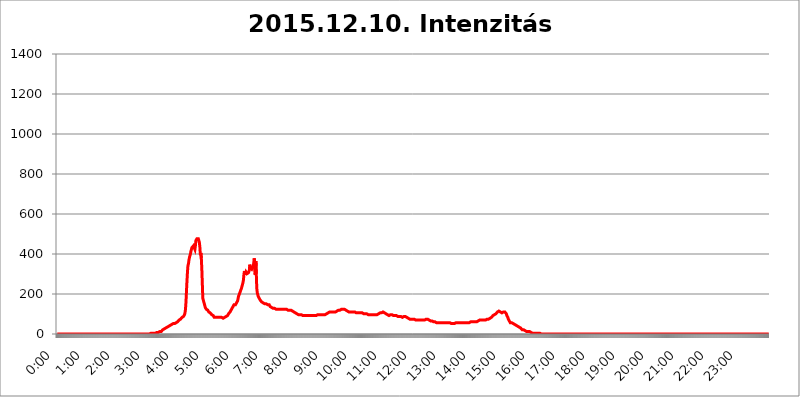
| Category | 2015.12.10. Intenzitás [W/m^2] |
|---|---|
| 0.0 | 0 |
| 0.0006944444444444445 | 0 |
| 0.001388888888888889 | 0 |
| 0.0020833333333333333 | 0 |
| 0.002777777777777778 | 0 |
| 0.003472222222222222 | 0 |
| 0.004166666666666667 | 0 |
| 0.004861111111111111 | 0 |
| 0.005555555555555556 | 0 |
| 0.0062499999999999995 | 0 |
| 0.006944444444444444 | 0 |
| 0.007638888888888889 | 0 |
| 0.008333333333333333 | 0 |
| 0.009027777777777779 | 0 |
| 0.009722222222222222 | 0 |
| 0.010416666666666666 | 0 |
| 0.011111111111111112 | 0 |
| 0.011805555555555555 | 0 |
| 0.012499999999999999 | 0 |
| 0.013194444444444444 | 0 |
| 0.013888888888888888 | 0 |
| 0.014583333333333332 | 0 |
| 0.015277777777777777 | 0 |
| 0.015972222222222224 | 0 |
| 0.016666666666666666 | 0 |
| 0.017361111111111112 | 0 |
| 0.018055555555555557 | 0 |
| 0.01875 | 0 |
| 0.019444444444444445 | 0 |
| 0.02013888888888889 | 0 |
| 0.020833333333333332 | 0 |
| 0.02152777777777778 | 0 |
| 0.022222222222222223 | 0 |
| 0.02291666666666667 | 0 |
| 0.02361111111111111 | 0 |
| 0.024305555555555556 | 0 |
| 0.024999999999999998 | 0 |
| 0.025694444444444447 | 0 |
| 0.02638888888888889 | 0 |
| 0.027083333333333334 | 0 |
| 0.027777777777777776 | 0 |
| 0.02847222222222222 | 0 |
| 0.029166666666666664 | 0 |
| 0.029861111111111113 | 0 |
| 0.030555555555555555 | 0 |
| 0.03125 | 0 |
| 0.03194444444444445 | 0 |
| 0.03263888888888889 | 0 |
| 0.03333333333333333 | 0 |
| 0.034027777777777775 | 0 |
| 0.034722222222222224 | 0 |
| 0.035416666666666666 | 0 |
| 0.036111111111111115 | 0 |
| 0.03680555555555556 | 0 |
| 0.0375 | 0 |
| 0.03819444444444444 | 0 |
| 0.03888888888888889 | 0 |
| 0.03958333333333333 | 0 |
| 0.04027777777777778 | 0 |
| 0.04097222222222222 | 0 |
| 0.041666666666666664 | 0 |
| 0.042361111111111106 | 0 |
| 0.04305555555555556 | 0 |
| 0.043750000000000004 | 0 |
| 0.044444444444444446 | 0 |
| 0.04513888888888889 | 0 |
| 0.04583333333333334 | 0 |
| 0.04652777777777778 | 0 |
| 0.04722222222222222 | 0 |
| 0.04791666666666666 | 0 |
| 0.04861111111111111 | 0 |
| 0.049305555555555554 | 0 |
| 0.049999999999999996 | 0 |
| 0.05069444444444445 | 0 |
| 0.051388888888888894 | 0 |
| 0.052083333333333336 | 0 |
| 0.05277777777777778 | 0 |
| 0.05347222222222222 | 0 |
| 0.05416666666666667 | 0 |
| 0.05486111111111111 | 0 |
| 0.05555555555555555 | 0 |
| 0.05625 | 0 |
| 0.05694444444444444 | 0 |
| 0.057638888888888885 | 0 |
| 0.05833333333333333 | 0 |
| 0.05902777777777778 | 0 |
| 0.059722222222222225 | 0 |
| 0.06041666666666667 | 0 |
| 0.061111111111111116 | 0 |
| 0.06180555555555556 | 0 |
| 0.0625 | 0 |
| 0.06319444444444444 | 0 |
| 0.06388888888888888 | 0 |
| 0.06458333333333334 | 0 |
| 0.06527777777777778 | 0 |
| 0.06597222222222222 | 0 |
| 0.06666666666666667 | 0 |
| 0.06736111111111111 | 0 |
| 0.06805555555555555 | 0 |
| 0.06874999999999999 | 0 |
| 0.06944444444444443 | 0 |
| 0.07013888888888889 | 0 |
| 0.07083333333333333 | 0 |
| 0.07152777777777779 | 0 |
| 0.07222222222222223 | 0 |
| 0.07291666666666667 | 0 |
| 0.07361111111111111 | 0 |
| 0.07430555555555556 | 0 |
| 0.075 | 0 |
| 0.07569444444444444 | 0 |
| 0.0763888888888889 | 0 |
| 0.07708333333333334 | 0 |
| 0.07777777777777778 | 0 |
| 0.07847222222222222 | 0 |
| 0.07916666666666666 | 0 |
| 0.0798611111111111 | 0 |
| 0.08055555555555556 | 0 |
| 0.08125 | 0 |
| 0.08194444444444444 | 0 |
| 0.08263888888888889 | 0 |
| 0.08333333333333333 | 0 |
| 0.08402777777777777 | 0 |
| 0.08472222222222221 | 0 |
| 0.08541666666666665 | 0 |
| 0.08611111111111112 | 0 |
| 0.08680555555555557 | 0 |
| 0.08750000000000001 | 0 |
| 0.08819444444444445 | 0 |
| 0.08888888888888889 | 0 |
| 0.08958333333333333 | 0 |
| 0.09027777777777778 | 0 |
| 0.09097222222222222 | 0 |
| 0.09166666666666667 | 0 |
| 0.09236111111111112 | 0 |
| 0.09305555555555556 | 0 |
| 0.09375 | 0 |
| 0.09444444444444444 | 0 |
| 0.09513888888888888 | 0 |
| 0.09583333333333333 | 0 |
| 0.09652777777777777 | 0 |
| 0.09722222222222222 | 0 |
| 0.09791666666666667 | 0 |
| 0.09861111111111111 | 0 |
| 0.09930555555555555 | 0 |
| 0.09999999999999999 | 0 |
| 0.10069444444444443 | 0 |
| 0.1013888888888889 | 0 |
| 0.10208333333333335 | 0 |
| 0.10277777777777779 | 0 |
| 0.10347222222222223 | 0 |
| 0.10416666666666667 | 0 |
| 0.10486111111111111 | 0 |
| 0.10555555555555556 | 0 |
| 0.10625 | 0 |
| 0.10694444444444444 | 0 |
| 0.1076388888888889 | 0 |
| 0.10833333333333334 | 0 |
| 0.10902777777777778 | 0 |
| 0.10972222222222222 | 0 |
| 0.1111111111111111 | 0 |
| 0.11180555555555556 | 0 |
| 0.11180555555555556 | 0 |
| 0.1125 | 0 |
| 0.11319444444444444 | 0 |
| 0.11388888888888889 | 0 |
| 0.11458333333333333 | 0 |
| 0.11527777777777777 | 0 |
| 0.11597222222222221 | 0 |
| 0.11666666666666665 | 0 |
| 0.1173611111111111 | 0 |
| 0.11805555555555557 | 0 |
| 0.11944444444444445 | 0 |
| 0.12013888888888889 | 0 |
| 0.12083333333333333 | 0 |
| 0.12152777777777778 | 0 |
| 0.12222222222222223 | 0 |
| 0.12291666666666667 | 0 |
| 0.12291666666666667 | 0 |
| 0.12361111111111112 | 0 |
| 0.12430555555555556 | 0 |
| 0.125 | 0 |
| 0.12569444444444444 | 0 |
| 0.12638888888888888 | 0 |
| 0.12708333333333333 | 0 |
| 0.16875 | 0 |
| 0.12847222222222224 | 3.525 |
| 0.12916666666666668 | 0 |
| 0.12986111111111112 | 3.525 |
| 0.13055555555555556 | 3.525 |
| 0.13125 | 3.525 |
| 0.13194444444444445 | 3.525 |
| 0.1326388888888889 | 3.525 |
| 0.13333333333333333 | 3.525 |
| 0.13402777777777777 | 3.525 |
| 0.13402777777777777 | 3.525 |
| 0.13472222222222222 | 3.525 |
| 0.13541666666666666 | 3.525 |
| 0.1361111111111111 | 3.525 |
| 0.13749999999999998 | 3.525 |
| 0.13819444444444443 | 3.525 |
| 0.1388888888888889 | 7.887 |
| 0.13958333333333334 | 7.887 |
| 0.14027777777777778 | 7.887 |
| 0.14097222222222222 | 7.887 |
| 0.14166666666666666 | 7.887 |
| 0.1423611111111111 | 12.257 |
| 0.14305555555555557 | 12.257 |
| 0.14375000000000002 | 12.257 |
| 0.14444444444444446 | 12.257 |
| 0.1451388888888889 | 12.257 |
| 0.1451388888888889 | 12.257 |
| 0.14652777777777778 | 16.636 |
| 0.14722222222222223 | 16.636 |
| 0.14791666666666667 | 21.024 |
| 0.1486111111111111 | 21.024 |
| 0.14930555555555555 | 21.024 |
| 0.15 | 25.419 |
| 0.15069444444444444 | 25.419 |
| 0.15138888888888888 | 25.419 |
| 0.15208333333333332 | 29.823 |
| 0.15277777777777776 | 29.823 |
| 0.15347222222222223 | 29.823 |
| 0.15416666666666667 | 34.234 |
| 0.15486111111111112 | 34.234 |
| 0.15555555555555556 | 38.653 |
| 0.15625 | 38.653 |
| 0.15694444444444444 | 38.653 |
| 0.15763888888888888 | 43.079 |
| 0.15833333333333333 | 43.079 |
| 0.15902777777777777 | 43.079 |
| 0.15972222222222224 | 47.511 |
| 0.16041666666666668 | 47.511 |
| 0.16111111111111112 | 51.951 |
| 0.16180555555555556 | 51.951 |
| 0.1625 | 51.951 |
| 0.16319444444444445 | 51.951 |
| 0.1638888888888889 | 51.951 |
| 0.16458333333333333 | 51.951 |
| 0.16527777777777777 | 56.398 |
| 0.16597222222222222 | 56.398 |
| 0.16666666666666666 | 56.398 |
| 0.1673611111111111 | 56.398 |
| 0.16805555555555554 | 56.398 |
| 0.16874999999999998 | 60.85 |
| 0.16944444444444443 | 60.85 |
| 0.17013888888888887 | 65.31 |
| 0.1708333333333333 | 69.775 |
| 0.17152777777777775 | 69.775 |
| 0.17222222222222225 | 74.246 |
| 0.1729166666666667 | 74.246 |
| 0.17361111111111113 | 78.722 |
| 0.17430555555555557 | 78.722 |
| 0.17500000000000002 | 83.205 |
| 0.17569444444444446 | 83.205 |
| 0.1763888888888889 | 83.205 |
| 0.17708333333333334 | 87.692 |
| 0.17777777777777778 | 92.184 |
| 0.17847222222222223 | 96.682 |
| 0.17916666666666667 | 105.69 |
| 0.1798611111111111 | 123.758 |
| 0.18055555555555555 | 160.056 |
| 0.18125 | 214.746 |
| 0.18194444444444444 | 264.932 |
| 0.1826388888888889 | 310.44 |
| 0.18333333333333335 | 342.162 |
| 0.1840277777777778 | 351.198 |
| 0.18472222222222223 | 369.23 |
| 0.18541666666666667 | 382.715 |
| 0.18611111111111112 | 387.202 |
| 0.18680555555555556 | 400.638 |
| 0.1875 | 414.035 |
| 0.18819444444444444 | 422.943 |
| 0.18888888888888888 | 431.833 |
| 0.18958333333333333 | 436.27 |
| 0.19027777777777777 | 436.27 |
| 0.1909722222222222 | 440.702 |
| 0.19166666666666665 | 445.129 |
| 0.19236111111111112 | 445.129 |
| 0.19305555555555554 | 422.943 |
| 0.19375 | 440.702 |
| 0.19444444444444445 | 467.187 |
| 0.1951388888888889 | 467.187 |
| 0.19583333333333333 | 475.972 |
| 0.19652777777777777 | 475.972 |
| 0.19722222222222222 | 475.972 |
| 0.19791666666666666 | 475.972 |
| 0.1986111111111111 | 467.187 |
| 0.19930555555555554 | 458.38 |
| 0.19999999999999998 | 436.27 |
| 0.20069444444444443 | 396.164 |
| 0.20138888888888887 | 405.108 |
| 0.2020833333333333 | 378.224 |
| 0.2027777777777778 | 324.052 |
| 0.2034722222222222 | 251.251 |
| 0.2041666666666667 | 178.264 |
| 0.20486111111111113 | 173.709 |
| 0.20555555555555557 | 160.056 |
| 0.20625000000000002 | 150.964 |
| 0.20694444444444446 | 141.884 |
| 0.2076388888888889 | 132.814 |
| 0.20833333333333334 | 128.284 |
| 0.20902777777777778 | 123.758 |
| 0.20972222222222223 | 123.758 |
| 0.21041666666666667 | 119.235 |
| 0.2111111111111111 | 119.235 |
| 0.21180555555555555 | 114.716 |
| 0.2125 | 110.201 |
| 0.21319444444444444 | 110.201 |
| 0.2138888888888889 | 105.69 |
| 0.21458333333333335 | 105.69 |
| 0.2152777777777778 | 101.184 |
| 0.21597222222222223 | 101.184 |
| 0.21666666666666667 | 96.682 |
| 0.21736111111111112 | 96.682 |
| 0.21805555555555556 | 96.682 |
| 0.21875 | 92.184 |
| 0.21944444444444444 | 87.692 |
| 0.22013888888888888 | 83.205 |
| 0.22083333333333333 | 83.205 |
| 0.22152777777777777 | 83.205 |
| 0.2222222222222222 | 83.205 |
| 0.22291666666666665 | 78.722 |
| 0.2236111111111111 | 83.205 |
| 0.22430555555555556 | 83.205 |
| 0.225 | 83.205 |
| 0.22569444444444445 | 83.205 |
| 0.2263888888888889 | 83.205 |
| 0.22708333333333333 | 83.205 |
| 0.22777777777777777 | 83.205 |
| 0.22847222222222222 | 83.205 |
| 0.22916666666666666 | 83.205 |
| 0.2298611111111111 | 83.205 |
| 0.23055555555555554 | 83.205 |
| 0.23124999999999998 | 78.722 |
| 0.23194444444444443 | 78.722 |
| 0.23263888888888887 | 78.722 |
| 0.2333333333333333 | 78.722 |
| 0.2340277777777778 | 83.205 |
| 0.2347222222222222 | 83.205 |
| 0.2354166666666667 | 83.205 |
| 0.23611111111111113 | 83.205 |
| 0.23680555555555557 | 87.692 |
| 0.23750000000000002 | 92.184 |
| 0.23819444444444446 | 92.184 |
| 0.2388888888888889 | 92.184 |
| 0.23958333333333334 | 96.682 |
| 0.24027777777777778 | 101.184 |
| 0.24097222222222223 | 101.184 |
| 0.24166666666666667 | 105.69 |
| 0.2423611111111111 | 110.201 |
| 0.24305555555555555 | 114.716 |
| 0.24375 | 119.235 |
| 0.24444444444444446 | 123.758 |
| 0.24513888888888888 | 128.284 |
| 0.24583333333333335 | 132.814 |
| 0.2465277777777778 | 137.347 |
| 0.24722222222222223 | 141.884 |
| 0.24791666666666667 | 146.423 |
| 0.24861111111111112 | 146.423 |
| 0.24930555555555556 | 146.423 |
| 0.25 | 146.423 |
| 0.25069444444444444 | 150.964 |
| 0.2513888888888889 | 155.509 |
| 0.2520833333333333 | 160.056 |
| 0.25277777777777777 | 164.605 |
| 0.2534722222222222 | 173.709 |
| 0.25416666666666665 | 187.378 |
| 0.2548611111111111 | 191.937 |
| 0.2555555555555556 | 201.058 |
| 0.25625000000000003 | 205.62 |
| 0.2569444444444445 | 214.746 |
| 0.2576388888888889 | 219.309 |
| 0.25833333333333336 | 228.436 |
| 0.2590277777777778 | 237.564 |
| 0.25972222222222224 | 246.689 |
| 0.2604166666666667 | 255.813 |
| 0.2611111111111111 | 269.49 |
| 0.26180555555555557 | 296.808 |
| 0.2625 | 314.98 |
| 0.26319444444444445 | 296.808 |
| 0.2638888888888889 | 296.808 |
| 0.26458333333333334 | 310.44 |
| 0.2652777777777778 | 305.898 |
| 0.2659722222222222 | 301.354 |
| 0.26666666666666666 | 296.808 |
| 0.2673611111111111 | 301.354 |
| 0.26805555555555555 | 305.898 |
| 0.26875 | 305.898 |
| 0.26944444444444443 | 319.517 |
| 0.2701388888888889 | 346.682 |
| 0.2708333333333333 | 333.113 |
| 0.27152777777777776 | 337.639 |
| 0.2722222222222222 | 333.113 |
| 0.27291666666666664 | 324.052 |
| 0.2736111111111111 | 328.584 |
| 0.2743055555555555 | 328.584 |
| 0.27499999999999997 | 337.639 |
| 0.27569444444444446 | 360.221 |
| 0.27638888888888885 | 378.224 |
| 0.27708333333333335 | 373.729 |
| 0.2777777777777778 | 296.808 |
| 0.27847222222222223 | 364.728 |
| 0.2791666666666667 | 301.354 |
| 0.2798611111111111 | 228.436 |
| 0.28055555555555556 | 205.62 |
| 0.28125 | 196.497 |
| 0.28194444444444444 | 187.378 |
| 0.2826388888888889 | 182.82 |
| 0.2833333333333333 | 178.264 |
| 0.28402777777777777 | 173.709 |
| 0.2847222222222222 | 169.156 |
| 0.28541666666666665 | 164.605 |
| 0.28611111111111115 | 164.605 |
| 0.28680555555555554 | 160.056 |
| 0.28750000000000003 | 160.056 |
| 0.2881944444444445 | 155.509 |
| 0.2888888888888889 | 155.509 |
| 0.28958333333333336 | 155.509 |
| 0.2902777777777778 | 155.509 |
| 0.29097222222222224 | 150.964 |
| 0.2916666666666667 | 150.964 |
| 0.2923611111111111 | 150.964 |
| 0.29305555555555557 | 150.964 |
| 0.29375 | 150.964 |
| 0.29444444444444445 | 150.964 |
| 0.2951388888888889 | 146.423 |
| 0.29583333333333334 | 146.423 |
| 0.2965277777777778 | 146.423 |
| 0.2972222222222222 | 146.423 |
| 0.29791666666666666 | 141.884 |
| 0.2986111111111111 | 137.347 |
| 0.29930555555555555 | 137.347 |
| 0.3 | 137.347 |
| 0.30069444444444443 | 132.814 |
| 0.3013888888888889 | 132.814 |
| 0.3020833333333333 | 132.814 |
| 0.30277777777777776 | 128.284 |
| 0.3034722222222222 | 128.284 |
| 0.30416666666666664 | 128.284 |
| 0.3048611111111111 | 128.284 |
| 0.3055555555555555 | 128.284 |
| 0.30624999999999997 | 123.758 |
| 0.3069444444444444 | 123.758 |
| 0.3076388888888889 | 123.758 |
| 0.30833333333333335 | 123.758 |
| 0.3090277777777778 | 123.758 |
| 0.30972222222222223 | 123.758 |
| 0.3104166666666667 | 123.758 |
| 0.3111111111111111 | 123.758 |
| 0.31180555555555556 | 123.758 |
| 0.3125 | 123.758 |
| 0.31319444444444444 | 123.758 |
| 0.3138888888888889 | 123.758 |
| 0.3145833333333333 | 123.758 |
| 0.31527777777777777 | 123.758 |
| 0.3159722222222222 | 123.758 |
| 0.31666666666666665 | 123.758 |
| 0.31736111111111115 | 123.758 |
| 0.31805555555555554 | 123.758 |
| 0.31875000000000003 | 128.284 |
| 0.3194444444444445 | 123.758 |
| 0.3201388888888889 | 123.758 |
| 0.32083333333333336 | 123.758 |
| 0.3215277777777778 | 123.758 |
| 0.32222222222222224 | 119.235 |
| 0.3229166666666667 | 119.235 |
| 0.3236111111111111 | 119.235 |
| 0.32430555555555557 | 119.235 |
| 0.325 | 119.235 |
| 0.32569444444444445 | 119.235 |
| 0.3263888888888889 | 119.235 |
| 0.32708333333333334 | 119.235 |
| 0.3277777777777778 | 119.235 |
| 0.3284722222222222 | 114.716 |
| 0.32916666666666666 | 114.716 |
| 0.3298611111111111 | 114.716 |
| 0.33055555555555555 | 110.201 |
| 0.33125 | 110.201 |
| 0.33194444444444443 | 110.201 |
| 0.3326388888888889 | 110.201 |
| 0.3333333333333333 | 105.69 |
| 0.3340277777777778 | 105.69 |
| 0.3347222222222222 | 101.184 |
| 0.3354166666666667 | 105.69 |
| 0.3361111111111111 | 101.184 |
| 0.3368055555555556 | 101.184 |
| 0.33749999999999997 | 101.184 |
| 0.33819444444444446 | 96.682 |
| 0.33888888888888885 | 96.682 |
| 0.33958333333333335 | 96.682 |
| 0.34027777777777773 | 96.682 |
| 0.34097222222222223 | 96.682 |
| 0.3416666666666666 | 96.682 |
| 0.3423611111111111 | 96.682 |
| 0.3430555555555555 | 96.682 |
| 0.34375 | 96.682 |
| 0.3444444444444445 | 92.184 |
| 0.3451388888888889 | 92.184 |
| 0.3458333333333334 | 92.184 |
| 0.34652777777777777 | 92.184 |
| 0.34722222222222227 | 92.184 |
| 0.34791666666666665 | 92.184 |
| 0.34861111111111115 | 92.184 |
| 0.34930555555555554 | 92.184 |
| 0.35000000000000003 | 92.184 |
| 0.3506944444444444 | 92.184 |
| 0.3513888888888889 | 92.184 |
| 0.3520833333333333 | 92.184 |
| 0.3527777777777778 | 92.184 |
| 0.3534722222222222 | 92.184 |
| 0.3541666666666667 | 92.184 |
| 0.3548611111111111 | 92.184 |
| 0.35555555555555557 | 92.184 |
| 0.35625 | 92.184 |
| 0.35694444444444445 | 92.184 |
| 0.3576388888888889 | 96.682 |
| 0.35833333333333334 | 92.184 |
| 0.3590277777777778 | 92.184 |
| 0.3597222222222222 | 92.184 |
| 0.36041666666666666 | 92.184 |
| 0.3611111111111111 | 92.184 |
| 0.36180555555555555 | 92.184 |
| 0.3625 | 92.184 |
| 0.36319444444444443 | 92.184 |
| 0.3638888888888889 | 92.184 |
| 0.3645833333333333 | 96.682 |
| 0.3652777777777778 | 96.682 |
| 0.3659722222222222 | 96.682 |
| 0.3666666666666667 | 96.682 |
| 0.3673611111111111 | 96.682 |
| 0.3680555555555556 | 96.682 |
| 0.36874999999999997 | 96.682 |
| 0.36944444444444446 | 96.682 |
| 0.37013888888888885 | 96.682 |
| 0.37083333333333335 | 96.682 |
| 0.37152777777777773 | 96.682 |
| 0.37222222222222223 | 96.682 |
| 0.3729166666666666 | 96.682 |
| 0.3736111111111111 | 96.682 |
| 0.3743055555555555 | 96.682 |
| 0.375 | 96.682 |
| 0.3756944444444445 | 96.682 |
| 0.3763888888888889 | 96.682 |
| 0.3770833333333334 | 96.682 |
| 0.37777777777777777 | 101.184 |
| 0.37847222222222227 | 101.184 |
| 0.37916666666666665 | 101.184 |
| 0.37986111111111115 | 105.69 |
| 0.38055555555555554 | 105.69 |
| 0.38125000000000003 | 105.69 |
| 0.3819444444444444 | 110.201 |
| 0.3826388888888889 | 110.201 |
| 0.3833333333333333 | 110.201 |
| 0.3840277777777778 | 110.201 |
| 0.3847222222222222 | 110.201 |
| 0.3854166666666667 | 110.201 |
| 0.3861111111111111 | 110.201 |
| 0.38680555555555557 | 110.201 |
| 0.3875 | 110.201 |
| 0.38819444444444445 | 110.201 |
| 0.3888888888888889 | 110.201 |
| 0.38958333333333334 | 110.201 |
| 0.3902777777777778 | 110.201 |
| 0.3909722222222222 | 110.201 |
| 0.39166666666666666 | 114.716 |
| 0.3923611111111111 | 114.716 |
| 0.39305555555555555 | 114.716 |
| 0.39375 | 114.716 |
| 0.39444444444444443 | 119.235 |
| 0.3951388888888889 | 119.235 |
| 0.3958333333333333 | 119.235 |
| 0.3965277777777778 | 119.235 |
| 0.3972222222222222 | 119.235 |
| 0.3979166666666667 | 119.235 |
| 0.3986111111111111 | 123.758 |
| 0.3993055555555556 | 123.758 |
| 0.39999999999999997 | 123.758 |
| 0.40069444444444446 | 123.758 |
| 0.40138888888888885 | 123.758 |
| 0.40208333333333335 | 123.758 |
| 0.40277777777777773 | 123.758 |
| 0.40347222222222223 | 123.758 |
| 0.4041666666666666 | 123.758 |
| 0.4048611111111111 | 119.235 |
| 0.4055555555555555 | 119.235 |
| 0.40625 | 119.235 |
| 0.4069444444444445 | 114.716 |
| 0.4076388888888889 | 114.716 |
| 0.4083333333333334 | 114.716 |
| 0.40902777777777777 | 110.201 |
| 0.40972222222222227 | 110.201 |
| 0.41041666666666665 | 110.201 |
| 0.41111111111111115 | 110.201 |
| 0.41180555555555554 | 110.201 |
| 0.41250000000000003 | 110.201 |
| 0.4131944444444444 | 110.201 |
| 0.4138888888888889 | 110.201 |
| 0.4145833333333333 | 110.201 |
| 0.4152777777777778 | 110.201 |
| 0.4159722222222222 | 110.201 |
| 0.4166666666666667 | 110.201 |
| 0.4173611111111111 | 110.201 |
| 0.41805555555555557 | 110.201 |
| 0.41875 | 110.201 |
| 0.41944444444444445 | 105.69 |
| 0.4201388888888889 | 105.69 |
| 0.42083333333333334 | 105.69 |
| 0.4215277777777778 | 105.69 |
| 0.4222222222222222 | 105.69 |
| 0.42291666666666666 | 105.69 |
| 0.4236111111111111 | 105.69 |
| 0.42430555555555555 | 105.69 |
| 0.425 | 105.69 |
| 0.42569444444444443 | 105.69 |
| 0.4263888888888889 | 105.69 |
| 0.4270833333333333 | 105.69 |
| 0.4277777777777778 | 105.69 |
| 0.4284722222222222 | 105.69 |
| 0.4291666666666667 | 105.69 |
| 0.4298611111111111 | 101.184 |
| 0.4305555555555556 | 101.184 |
| 0.43124999999999997 | 101.184 |
| 0.43194444444444446 | 101.184 |
| 0.43263888888888885 | 101.184 |
| 0.43333333333333335 | 101.184 |
| 0.43402777777777773 | 101.184 |
| 0.43472222222222223 | 101.184 |
| 0.4354166666666666 | 101.184 |
| 0.4361111111111111 | 96.682 |
| 0.4368055555555555 | 96.682 |
| 0.4375 | 96.682 |
| 0.4381944444444445 | 96.682 |
| 0.4388888888888889 | 96.682 |
| 0.4395833333333334 | 96.682 |
| 0.44027777777777777 | 96.682 |
| 0.44097222222222227 | 96.682 |
| 0.44166666666666665 | 96.682 |
| 0.44236111111111115 | 96.682 |
| 0.44305555555555554 | 96.682 |
| 0.44375000000000003 | 96.682 |
| 0.4444444444444444 | 96.682 |
| 0.4451388888888889 | 96.682 |
| 0.4458333333333333 | 96.682 |
| 0.4465277777777778 | 96.682 |
| 0.4472222222222222 | 96.682 |
| 0.4479166666666667 | 96.682 |
| 0.4486111111111111 | 96.682 |
| 0.44930555555555557 | 96.682 |
| 0.45 | 101.184 |
| 0.45069444444444445 | 101.184 |
| 0.4513888888888889 | 101.184 |
| 0.45208333333333334 | 101.184 |
| 0.4527777777777778 | 105.69 |
| 0.4534722222222222 | 105.69 |
| 0.45416666666666666 | 105.69 |
| 0.4548611111111111 | 105.69 |
| 0.45555555555555555 | 105.69 |
| 0.45625 | 110.201 |
| 0.45694444444444443 | 110.201 |
| 0.4576388888888889 | 110.201 |
| 0.4583333333333333 | 110.201 |
| 0.4590277777777778 | 105.69 |
| 0.4597222222222222 | 105.69 |
| 0.4604166666666667 | 105.69 |
| 0.4611111111111111 | 101.184 |
| 0.4618055555555556 | 101.184 |
| 0.46249999999999997 | 101.184 |
| 0.46319444444444446 | 96.682 |
| 0.46388888888888885 | 96.682 |
| 0.46458333333333335 | 92.184 |
| 0.46527777777777773 | 92.184 |
| 0.46597222222222223 | 92.184 |
| 0.4666666666666666 | 92.184 |
| 0.4673611111111111 | 96.682 |
| 0.4680555555555555 | 96.682 |
| 0.46875 | 96.682 |
| 0.4694444444444445 | 96.682 |
| 0.4701388888888889 | 96.682 |
| 0.4708333333333334 | 92.184 |
| 0.47152777777777777 | 92.184 |
| 0.47222222222222227 | 92.184 |
| 0.47291666666666665 | 92.184 |
| 0.47361111111111115 | 92.184 |
| 0.47430555555555554 | 92.184 |
| 0.47500000000000003 | 92.184 |
| 0.4756944444444444 | 92.184 |
| 0.4763888888888889 | 87.692 |
| 0.4770833333333333 | 87.692 |
| 0.4777777777777778 | 87.692 |
| 0.4784722222222222 | 87.692 |
| 0.4791666666666667 | 87.692 |
| 0.4798611111111111 | 87.692 |
| 0.48055555555555557 | 87.692 |
| 0.48125 | 87.692 |
| 0.48194444444444445 | 87.692 |
| 0.4826388888888889 | 83.205 |
| 0.48333333333333334 | 83.205 |
| 0.4840277777777778 | 83.205 |
| 0.4847222222222222 | 83.205 |
| 0.48541666666666666 | 87.692 |
| 0.4861111111111111 | 87.692 |
| 0.48680555555555555 | 87.692 |
| 0.4875 | 87.692 |
| 0.48819444444444443 | 87.692 |
| 0.4888888888888889 | 87.692 |
| 0.4895833333333333 | 83.205 |
| 0.4902777777777778 | 83.205 |
| 0.4909722222222222 | 83.205 |
| 0.4916666666666667 | 78.722 |
| 0.4923611111111111 | 78.722 |
| 0.4930555555555556 | 78.722 |
| 0.49374999999999997 | 74.246 |
| 0.49444444444444446 | 74.246 |
| 0.49513888888888885 | 74.246 |
| 0.49583333333333335 | 74.246 |
| 0.49652777777777773 | 74.246 |
| 0.49722222222222223 | 74.246 |
| 0.4979166666666666 | 74.246 |
| 0.4986111111111111 | 74.246 |
| 0.4993055555555555 | 74.246 |
| 0.5 | 74.246 |
| 0.5006944444444444 | 74.246 |
| 0.5013888888888889 | 74.246 |
| 0.5020833333333333 | 74.246 |
| 0.5027777777777778 | 69.775 |
| 0.5034722222222222 | 69.775 |
| 0.5041666666666667 | 69.775 |
| 0.5048611111111111 | 69.775 |
| 0.5055555555555555 | 69.775 |
| 0.50625 | 69.775 |
| 0.5069444444444444 | 69.775 |
| 0.5076388888888889 | 69.775 |
| 0.5083333333333333 | 69.775 |
| 0.5090277777777777 | 69.775 |
| 0.5097222222222222 | 69.775 |
| 0.5104166666666666 | 69.775 |
| 0.5111111111111112 | 69.775 |
| 0.5118055555555555 | 69.775 |
| 0.5125000000000001 | 69.775 |
| 0.5131944444444444 | 69.775 |
| 0.513888888888889 | 69.775 |
| 0.5145833333333333 | 69.775 |
| 0.5152777777777778 | 69.775 |
| 0.5159722222222222 | 69.775 |
| 0.5166666666666667 | 74.246 |
| 0.517361111111111 | 74.246 |
| 0.5180555555555556 | 74.246 |
| 0.5187499999999999 | 74.246 |
| 0.5194444444444445 | 74.246 |
| 0.5201388888888888 | 69.775 |
| 0.5208333333333334 | 69.775 |
| 0.5215277777777778 | 69.775 |
| 0.5222222222222223 | 69.775 |
| 0.5229166666666667 | 69.775 |
| 0.5236111111111111 | 65.31 |
| 0.5243055555555556 | 65.31 |
| 0.525 | 65.31 |
| 0.5256944444444445 | 65.31 |
| 0.5263888888888889 | 65.31 |
| 0.5270833333333333 | 65.31 |
| 0.5277777777777778 | 60.85 |
| 0.5284722222222222 | 60.85 |
| 0.5291666666666667 | 60.85 |
| 0.5298611111111111 | 60.85 |
| 0.5305555555555556 | 60.85 |
| 0.53125 | 60.85 |
| 0.5319444444444444 | 56.398 |
| 0.5326388888888889 | 56.398 |
| 0.5333333333333333 | 56.398 |
| 0.5340277777777778 | 56.398 |
| 0.5347222222222222 | 56.398 |
| 0.5354166666666667 | 56.398 |
| 0.5361111111111111 | 56.398 |
| 0.5368055555555555 | 56.398 |
| 0.5375 | 56.398 |
| 0.5381944444444444 | 56.398 |
| 0.5388888888888889 | 56.398 |
| 0.5395833333333333 | 56.398 |
| 0.5402777777777777 | 56.398 |
| 0.5409722222222222 | 56.398 |
| 0.5416666666666666 | 56.398 |
| 0.5423611111111112 | 56.398 |
| 0.5430555555555555 | 56.398 |
| 0.5437500000000001 | 56.398 |
| 0.5444444444444444 | 56.398 |
| 0.545138888888889 | 56.398 |
| 0.5458333333333333 | 56.398 |
| 0.5465277777777778 | 56.398 |
| 0.5472222222222222 | 56.398 |
| 0.5479166666666667 | 56.398 |
| 0.548611111111111 | 56.398 |
| 0.5493055555555556 | 56.398 |
| 0.5499999999999999 | 56.398 |
| 0.5506944444444445 | 56.398 |
| 0.5513888888888888 | 56.398 |
| 0.5520833333333334 | 56.398 |
| 0.5527777777777778 | 51.951 |
| 0.5534722222222223 | 51.951 |
| 0.5541666666666667 | 51.951 |
| 0.5548611111111111 | 51.951 |
| 0.5555555555555556 | 51.951 |
| 0.55625 | 51.951 |
| 0.5569444444444445 | 51.951 |
| 0.5576388888888889 | 51.951 |
| 0.5583333333333333 | 51.951 |
| 0.5590277777777778 | 56.398 |
| 0.5597222222222222 | 56.398 |
| 0.5604166666666667 | 56.398 |
| 0.5611111111111111 | 56.398 |
| 0.5618055555555556 | 56.398 |
| 0.5625 | 56.398 |
| 0.5631944444444444 | 56.398 |
| 0.5638888888888889 | 56.398 |
| 0.5645833333333333 | 56.398 |
| 0.5652777777777778 | 56.398 |
| 0.5659722222222222 | 56.398 |
| 0.5666666666666667 | 56.398 |
| 0.5673611111111111 | 56.398 |
| 0.5680555555555555 | 56.398 |
| 0.56875 | 56.398 |
| 0.5694444444444444 | 56.398 |
| 0.5701388888888889 | 56.398 |
| 0.5708333333333333 | 56.398 |
| 0.5715277777777777 | 56.398 |
| 0.5722222222222222 | 56.398 |
| 0.5729166666666666 | 56.398 |
| 0.5736111111111112 | 56.398 |
| 0.5743055555555555 | 56.398 |
| 0.5750000000000001 | 56.398 |
| 0.5756944444444444 | 56.398 |
| 0.576388888888889 | 56.398 |
| 0.5770833333333333 | 56.398 |
| 0.5777777777777778 | 56.398 |
| 0.5784722222222222 | 56.398 |
| 0.5791666666666667 | 60.85 |
| 0.579861111111111 | 60.85 |
| 0.5805555555555556 | 60.85 |
| 0.5812499999999999 | 60.85 |
| 0.5819444444444445 | 60.85 |
| 0.5826388888888888 | 60.85 |
| 0.5833333333333334 | 60.85 |
| 0.5840277777777778 | 60.85 |
| 0.5847222222222223 | 60.85 |
| 0.5854166666666667 | 60.85 |
| 0.5861111111111111 | 60.85 |
| 0.5868055555555556 | 60.85 |
| 0.5875 | 60.85 |
| 0.5881944444444445 | 60.85 |
| 0.5888888888888889 | 65.31 |
| 0.5895833333333333 | 65.31 |
| 0.5902777777777778 | 65.31 |
| 0.5909722222222222 | 65.31 |
| 0.5916666666666667 | 65.31 |
| 0.5923611111111111 | 69.775 |
| 0.5930555555555556 | 69.775 |
| 0.59375 | 69.775 |
| 0.5944444444444444 | 69.775 |
| 0.5951388888888889 | 69.775 |
| 0.5958333333333333 | 69.775 |
| 0.5965277777777778 | 69.775 |
| 0.5972222222222222 | 69.775 |
| 0.5979166666666667 | 69.775 |
| 0.5986111111111111 | 69.775 |
| 0.5993055555555555 | 69.775 |
| 0.6 | 69.775 |
| 0.6006944444444444 | 69.775 |
| 0.6013888888888889 | 74.246 |
| 0.6020833333333333 | 74.246 |
| 0.6027777777777777 | 74.246 |
| 0.6034722222222222 | 74.246 |
| 0.6041666666666666 | 74.246 |
| 0.6048611111111112 | 74.246 |
| 0.6055555555555555 | 78.722 |
| 0.6062500000000001 | 78.722 |
| 0.6069444444444444 | 78.722 |
| 0.607638888888889 | 78.722 |
| 0.6083333333333333 | 83.205 |
| 0.6090277777777778 | 83.205 |
| 0.6097222222222222 | 83.205 |
| 0.6104166666666667 | 87.692 |
| 0.611111111111111 | 92.184 |
| 0.6118055555555556 | 92.184 |
| 0.6124999999999999 | 96.682 |
| 0.6131944444444445 | 96.682 |
| 0.6138888888888888 | 101.184 |
| 0.6145833333333334 | 101.184 |
| 0.6152777777777778 | 101.184 |
| 0.6159722222222223 | 101.184 |
| 0.6166666666666667 | 105.69 |
| 0.6173611111111111 | 110.201 |
| 0.6180555555555556 | 110.201 |
| 0.61875 | 114.716 |
| 0.6194444444444445 | 114.716 |
| 0.6201388888888889 | 114.716 |
| 0.6208333333333333 | 110.201 |
| 0.6215277777777778 | 110.201 |
| 0.6222222222222222 | 110.201 |
| 0.6229166666666667 | 105.69 |
| 0.6236111111111111 | 105.69 |
| 0.6243055555555556 | 110.201 |
| 0.625 | 110.201 |
| 0.6256944444444444 | 110.201 |
| 0.6263888888888889 | 114.716 |
| 0.6270833333333333 | 110.201 |
| 0.6277777777777778 | 110.201 |
| 0.6284722222222222 | 110.201 |
| 0.6291666666666667 | 105.69 |
| 0.6298611111111111 | 101.184 |
| 0.6305555555555555 | 92.184 |
| 0.63125 | 87.692 |
| 0.6319444444444444 | 83.205 |
| 0.6326388888888889 | 74.246 |
| 0.6333333333333333 | 69.775 |
| 0.6340277777777777 | 65.31 |
| 0.6347222222222222 | 60.85 |
| 0.6354166666666666 | 56.398 |
| 0.6361111111111112 | 56.398 |
| 0.6368055555555555 | 56.398 |
| 0.6375000000000001 | 56.398 |
| 0.6381944444444444 | 51.951 |
| 0.638888888888889 | 51.951 |
| 0.6395833333333333 | 51.951 |
| 0.6402777777777778 | 51.951 |
| 0.6409722222222222 | 47.511 |
| 0.6416666666666667 | 47.511 |
| 0.642361111111111 | 47.511 |
| 0.6430555555555556 | 47.511 |
| 0.6437499999999999 | 43.079 |
| 0.6444444444444445 | 43.079 |
| 0.6451388888888888 | 38.653 |
| 0.6458333333333334 | 38.653 |
| 0.6465277777777778 | 38.653 |
| 0.6472222222222223 | 34.234 |
| 0.6479166666666667 | 34.234 |
| 0.6486111111111111 | 29.823 |
| 0.6493055555555556 | 29.823 |
| 0.65 | 29.823 |
| 0.6506944444444445 | 25.419 |
| 0.6513888888888889 | 25.419 |
| 0.6520833333333333 | 21.024 |
| 0.6527777777777778 | 21.024 |
| 0.6534722222222222 | 21.024 |
| 0.6541666666666667 | 21.024 |
| 0.6548611111111111 | 16.636 |
| 0.6555555555555556 | 16.636 |
| 0.65625 | 16.636 |
| 0.6569444444444444 | 16.636 |
| 0.6576388888888889 | 12.257 |
| 0.6583333333333333 | 12.257 |
| 0.6590277777777778 | 12.257 |
| 0.6597222222222222 | 12.257 |
| 0.6604166666666667 | 12.257 |
| 0.6611111111111111 | 12.257 |
| 0.6618055555555555 | 12.257 |
| 0.6625 | 12.257 |
| 0.6631944444444444 | 12.257 |
| 0.6638888888888889 | 7.887 |
| 0.6645833333333333 | 7.887 |
| 0.6652777777777777 | 7.887 |
| 0.6659722222222222 | 7.887 |
| 0.6666666666666666 | 3.525 |
| 0.6673611111111111 | 3.525 |
| 0.6680555555555556 | 3.525 |
| 0.6687500000000001 | 3.525 |
| 0.6694444444444444 | 3.525 |
| 0.6701388888888888 | 3.525 |
| 0.6708333333333334 | 3.525 |
| 0.6715277777777778 | 3.525 |
| 0.6722222222222222 | 3.525 |
| 0.6729166666666666 | 3.525 |
| 0.6736111111111112 | 3.525 |
| 0.6743055555555556 | 3.525 |
| 0.6749999999999999 | 3.525 |
| 0.6756944444444444 | 3.525 |
| 0.6763888888888889 | 3.525 |
| 0.6770833333333334 | 3.525 |
| 0.6777777777777777 | 3.525 |
| 0.6784722222222223 | 3.525 |
| 0.6791666666666667 | 0 |
| 0.6798611111111111 | 0 |
| 0.6805555555555555 | 0 |
| 0.68125 | 0 |
| 0.6819444444444445 | 0 |
| 0.6826388888888889 | 0 |
| 0.6833333333333332 | 0 |
| 0.6840277777777778 | 0 |
| 0.6847222222222222 | 0 |
| 0.6854166666666667 | 0 |
| 0.686111111111111 | 0 |
| 0.6868055555555556 | 0 |
| 0.6875 | 0 |
| 0.6881944444444444 | 0 |
| 0.688888888888889 | 0 |
| 0.6895833333333333 | 0 |
| 0.6902777777777778 | 0 |
| 0.6909722222222222 | 0 |
| 0.6916666666666668 | 0 |
| 0.6923611111111111 | 0 |
| 0.6930555555555555 | 0 |
| 0.69375 | 0 |
| 0.6944444444444445 | 0 |
| 0.6951388888888889 | 0 |
| 0.6958333333333333 | 0 |
| 0.6965277777777777 | 0 |
| 0.6972222222222223 | 0 |
| 0.6979166666666666 | 0 |
| 0.6986111111111111 | 0 |
| 0.6993055555555556 | 0 |
| 0.7000000000000001 | 0 |
| 0.7006944444444444 | 0 |
| 0.7013888888888888 | 0 |
| 0.7020833333333334 | 0 |
| 0.7027777777777778 | 0 |
| 0.7034722222222222 | 0 |
| 0.7041666666666666 | 0 |
| 0.7048611111111112 | 0 |
| 0.7055555555555556 | 0 |
| 0.7062499999999999 | 0 |
| 0.7069444444444444 | 0 |
| 0.7076388888888889 | 0 |
| 0.7083333333333334 | 0 |
| 0.7090277777777777 | 0 |
| 0.7097222222222223 | 0 |
| 0.7104166666666667 | 0 |
| 0.7111111111111111 | 0 |
| 0.7118055555555555 | 0 |
| 0.7125 | 0 |
| 0.7131944444444445 | 0 |
| 0.7138888888888889 | 0 |
| 0.7145833333333332 | 0 |
| 0.7152777777777778 | 0 |
| 0.7159722222222222 | 0 |
| 0.7166666666666667 | 0 |
| 0.717361111111111 | 0 |
| 0.7180555555555556 | 0 |
| 0.71875 | 0 |
| 0.7194444444444444 | 0 |
| 0.720138888888889 | 0 |
| 0.7208333333333333 | 0 |
| 0.7215277777777778 | 0 |
| 0.7222222222222222 | 0 |
| 0.7229166666666668 | 0 |
| 0.7236111111111111 | 0 |
| 0.7243055555555555 | 0 |
| 0.725 | 0 |
| 0.7256944444444445 | 0 |
| 0.7263888888888889 | 0 |
| 0.7270833333333333 | 0 |
| 0.7277777777777777 | 0 |
| 0.7284722222222223 | 0 |
| 0.7291666666666666 | 0 |
| 0.7298611111111111 | 0 |
| 0.7305555555555556 | 0 |
| 0.7312500000000001 | 0 |
| 0.7319444444444444 | 0 |
| 0.7326388888888888 | 0 |
| 0.7333333333333334 | 0 |
| 0.7340277777777778 | 0 |
| 0.7347222222222222 | 0 |
| 0.7354166666666666 | 0 |
| 0.7361111111111112 | 0 |
| 0.7368055555555556 | 0 |
| 0.7374999999999999 | 0 |
| 0.7381944444444444 | 0 |
| 0.7388888888888889 | 0 |
| 0.7395833333333334 | 0 |
| 0.7402777777777777 | 0 |
| 0.7409722222222223 | 0 |
| 0.7416666666666667 | 0 |
| 0.7423611111111111 | 0 |
| 0.7430555555555555 | 0 |
| 0.74375 | 0 |
| 0.7444444444444445 | 0 |
| 0.7451388888888889 | 0 |
| 0.7458333333333332 | 0 |
| 0.7465277777777778 | 0 |
| 0.7472222222222222 | 0 |
| 0.7479166666666667 | 0 |
| 0.748611111111111 | 0 |
| 0.7493055555555556 | 0 |
| 0.75 | 0 |
| 0.7506944444444444 | 0 |
| 0.751388888888889 | 0 |
| 0.7520833333333333 | 0 |
| 0.7527777777777778 | 0 |
| 0.7534722222222222 | 0 |
| 0.7541666666666668 | 0 |
| 0.7548611111111111 | 0 |
| 0.7555555555555555 | 0 |
| 0.75625 | 0 |
| 0.7569444444444445 | 0 |
| 0.7576388888888889 | 0 |
| 0.7583333333333333 | 0 |
| 0.7590277777777777 | 0 |
| 0.7597222222222223 | 0 |
| 0.7604166666666666 | 0 |
| 0.7611111111111111 | 0 |
| 0.7618055555555556 | 0 |
| 0.7625000000000001 | 0 |
| 0.7631944444444444 | 0 |
| 0.7638888888888888 | 0 |
| 0.7645833333333334 | 0 |
| 0.7652777777777778 | 0 |
| 0.7659722222222222 | 0 |
| 0.7666666666666666 | 0 |
| 0.7673611111111112 | 0 |
| 0.7680555555555556 | 0 |
| 0.7687499999999999 | 0 |
| 0.7694444444444444 | 0 |
| 0.7701388888888889 | 0 |
| 0.7708333333333334 | 0 |
| 0.7715277777777777 | 0 |
| 0.7722222222222223 | 0 |
| 0.7729166666666667 | 0 |
| 0.7736111111111111 | 0 |
| 0.7743055555555555 | 0 |
| 0.775 | 0 |
| 0.7756944444444445 | 0 |
| 0.7763888888888889 | 0 |
| 0.7770833333333332 | 0 |
| 0.7777777777777778 | 0 |
| 0.7784722222222222 | 0 |
| 0.7791666666666667 | 0 |
| 0.779861111111111 | 0 |
| 0.7805555555555556 | 0 |
| 0.78125 | 0 |
| 0.7819444444444444 | 0 |
| 0.782638888888889 | 0 |
| 0.7833333333333333 | 0 |
| 0.7840277777777778 | 0 |
| 0.7847222222222222 | 0 |
| 0.7854166666666668 | 0 |
| 0.7861111111111111 | 0 |
| 0.7868055555555555 | 0 |
| 0.7875 | 0 |
| 0.7881944444444445 | 0 |
| 0.7888888888888889 | 0 |
| 0.7895833333333333 | 0 |
| 0.7902777777777777 | 0 |
| 0.7909722222222223 | 0 |
| 0.7916666666666666 | 0 |
| 0.7923611111111111 | 0 |
| 0.7930555555555556 | 0 |
| 0.7937500000000001 | 0 |
| 0.7944444444444444 | 0 |
| 0.7951388888888888 | 0 |
| 0.7958333333333334 | 0 |
| 0.7965277777777778 | 0 |
| 0.7972222222222222 | 0 |
| 0.7979166666666666 | 0 |
| 0.7986111111111112 | 0 |
| 0.7993055555555556 | 0 |
| 0.7999999999999999 | 0 |
| 0.8006944444444444 | 0 |
| 0.8013888888888889 | 0 |
| 0.8020833333333334 | 0 |
| 0.8027777777777777 | 0 |
| 0.8034722222222223 | 0 |
| 0.8041666666666667 | 0 |
| 0.8048611111111111 | 0 |
| 0.8055555555555555 | 0 |
| 0.80625 | 0 |
| 0.8069444444444445 | 0 |
| 0.8076388888888889 | 0 |
| 0.8083333333333332 | 0 |
| 0.8090277777777778 | 0 |
| 0.8097222222222222 | 0 |
| 0.8104166666666667 | 0 |
| 0.811111111111111 | 0 |
| 0.8118055555555556 | 0 |
| 0.8125 | 0 |
| 0.8131944444444444 | 0 |
| 0.813888888888889 | 0 |
| 0.8145833333333333 | 0 |
| 0.8152777777777778 | 0 |
| 0.8159722222222222 | 0 |
| 0.8166666666666668 | 0 |
| 0.8173611111111111 | 0 |
| 0.8180555555555555 | 0 |
| 0.81875 | 0 |
| 0.8194444444444445 | 0 |
| 0.8201388888888889 | 0 |
| 0.8208333333333333 | 0 |
| 0.8215277777777777 | 0 |
| 0.8222222222222223 | 0 |
| 0.8229166666666666 | 0 |
| 0.8236111111111111 | 0 |
| 0.8243055555555556 | 0 |
| 0.8250000000000001 | 0 |
| 0.8256944444444444 | 0 |
| 0.8263888888888888 | 0 |
| 0.8270833333333334 | 0 |
| 0.8277777777777778 | 0 |
| 0.8284722222222222 | 0 |
| 0.8291666666666666 | 0 |
| 0.8298611111111112 | 0 |
| 0.8305555555555556 | 0 |
| 0.8312499999999999 | 0 |
| 0.8319444444444444 | 0 |
| 0.8326388888888889 | 0 |
| 0.8333333333333334 | 0 |
| 0.8340277777777777 | 0 |
| 0.8347222222222223 | 0 |
| 0.8354166666666667 | 0 |
| 0.8361111111111111 | 0 |
| 0.8368055555555555 | 0 |
| 0.8375 | 0 |
| 0.8381944444444445 | 0 |
| 0.8388888888888889 | 0 |
| 0.8395833333333332 | 0 |
| 0.8402777777777778 | 0 |
| 0.8409722222222222 | 0 |
| 0.8416666666666667 | 0 |
| 0.842361111111111 | 0 |
| 0.8430555555555556 | 0 |
| 0.84375 | 0 |
| 0.8444444444444444 | 0 |
| 0.845138888888889 | 0 |
| 0.8458333333333333 | 0 |
| 0.8465277777777778 | 0 |
| 0.8472222222222222 | 0 |
| 0.8479166666666668 | 0 |
| 0.8486111111111111 | 0 |
| 0.8493055555555555 | 0 |
| 0.85 | 0 |
| 0.8506944444444445 | 0 |
| 0.8513888888888889 | 0 |
| 0.8520833333333333 | 0 |
| 0.8527777777777777 | 0 |
| 0.8534722222222223 | 0 |
| 0.8541666666666666 | 0 |
| 0.8548611111111111 | 0 |
| 0.8555555555555556 | 0 |
| 0.8562500000000001 | 0 |
| 0.8569444444444444 | 0 |
| 0.8576388888888888 | 0 |
| 0.8583333333333334 | 0 |
| 0.8590277777777778 | 0 |
| 0.8597222222222222 | 0 |
| 0.8604166666666666 | 0 |
| 0.8611111111111112 | 0 |
| 0.8618055555555556 | 0 |
| 0.8624999999999999 | 0 |
| 0.8631944444444444 | 0 |
| 0.8638888888888889 | 0 |
| 0.8645833333333334 | 0 |
| 0.8652777777777777 | 0 |
| 0.8659722222222223 | 0 |
| 0.8666666666666667 | 0 |
| 0.8673611111111111 | 0 |
| 0.8680555555555555 | 0 |
| 0.86875 | 0 |
| 0.8694444444444445 | 0 |
| 0.8701388888888889 | 0 |
| 0.8708333333333332 | 0 |
| 0.8715277777777778 | 0 |
| 0.8722222222222222 | 0 |
| 0.8729166666666667 | 0 |
| 0.873611111111111 | 0 |
| 0.8743055555555556 | 0 |
| 0.875 | 0 |
| 0.8756944444444444 | 0 |
| 0.876388888888889 | 0 |
| 0.8770833333333333 | 0 |
| 0.8777777777777778 | 0 |
| 0.8784722222222222 | 0 |
| 0.8791666666666668 | 0 |
| 0.8798611111111111 | 0 |
| 0.8805555555555555 | 0 |
| 0.88125 | 0 |
| 0.8819444444444445 | 0 |
| 0.8826388888888889 | 0 |
| 0.8833333333333333 | 0 |
| 0.8840277777777777 | 0 |
| 0.8847222222222223 | 0 |
| 0.8854166666666666 | 0 |
| 0.8861111111111111 | 0 |
| 0.8868055555555556 | 0 |
| 0.8875000000000001 | 0 |
| 0.8881944444444444 | 0 |
| 0.8888888888888888 | 0 |
| 0.8895833333333334 | 0 |
| 0.8902777777777778 | 0 |
| 0.8909722222222222 | 0 |
| 0.8916666666666666 | 0 |
| 0.8923611111111112 | 0 |
| 0.8930555555555556 | 0 |
| 0.8937499999999999 | 0 |
| 0.8944444444444444 | 0 |
| 0.8951388888888889 | 0 |
| 0.8958333333333334 | 0 |
| 0.8965277777777777 | 0 |
| 0.8972222222222223 | 0 |
| 0.8979166666666667 | 0 |
| 0.8986111111111111 | 0 |
| 0.8993055555555555 | 0 |
| 0.9 | 0 |
| 0.9006944444444445 | 0 |
| 0.9013888888888889 | 0 |
| 0.9020833333333332 | 0 |
| 0.9027777777777778 | 0 |
| 0.9034722222222222 | 0 |
| 0.9041666666666667 | 0 |
| 0.904861111111111 | 0 |
| 0.9055555555555556 | 0 |
| 0.90625 | 0 |
| 0.9069444444444444 | 0 |
| 0.907638888888889 | 0 |
| 0.9083333333333333 | 0 |
| 0.9090277777777778 | 0 |
| 0.9097222222222222 | 0 |
| 0.9104166666666668 | 0 |
| 0.9111111111111111 | 0 |
| 0.9118055555555555 | 0 |
| 0.9125 | 0 |
| 0.9131944444444445 | 0 |
| 0.9138888888888889 | 0 |
| 0.9145833333333333 | 0 |
| 0.9152777777777777 | 0 |
| 0.9159722222222223 | 0 |
| 0.9166666666666666 | 0 |
| 0.9173611111111111 | 0 |
| 0.9180555555555556 | 0 |
| 0.9187500000000001 | 0 |
| 0.9194444444444444 | 0 |
| 0.9201388888888888 | 0 |
| 0.9208333333333334 | 0 |
| 0.9215277777777778 | 0 |
| 0.9222222222222222 | 0 |
| 0.9229166666666666 | 0 |
| 0.9236111111111112 | 0 |
| 0.9243055555555556 | 0 |
| 0.9249999999999999 | 0 |
| 0.9256944444444444 | 0 |
| 0.9263888888888889 | 0 |
| 0.9270833333333334 | 0 |
| 0.9277777777777777 | 0 |
| 0.9284722222222223 | 0 |
| 0.9291666666666667 | 0 |
| 0.9298611111111111 | 0 |
| 0.9305555555555555 | 0 |
| 0.93125 | 0 |
| 0.9319444444444445 | 0 |
| 0.9326388888888889 | 0 |
| 0.9333333333333332 | 0 |
| 0.9340277777777778 | 0 |
| 0.9347222222222222 | 0 |
| 0.9354166666666667 | 0 |
| 0.936111111111111 | 0 |
| 0.9368055555555556 | 0 |
| 0.9375 | 0 |
| 0.9381944444444444 | 0 |
| 0.938888888888889 | 0 |
| 0.9395833333333333 | 0 |
| 0.9402777777777778 | 0 |
| 0.9409722222222222 | 0 |
| 0.9416666666666668 | 0 |
| 0.9423611111111111 | 0 |
| 0.9430555555555555 | 0 |
| 0.94375 | 0 |
| 0.9444444444444445 | 0 |
| 0.9451388888888889 | 0 |
| 0.9458333333333333 | 0 |
| 0.9465277777777777 | 0 |
| 0.9472222222222223 | 0 |
| 0.9479166666666666 | 0 |
| 0.9486111111111111 | 0 |
| 0.9493055555555556 | 0 |
| 0.9500000000000001 | 0 |
| 0.9506944444444444 | 0 |
| 0.9513888888888888 | 0 |
| 0.9520833333333334 | 0 |
| 0.9527777777777778 | 0 |
| 0.9534722222222222 | 0 |
| 0.9541666666666666 | 0 |
| 0.9548611111111112 | 0 |
| 0.9555555555555556 | 0 |
| 0.9562499999999999 | 0 |
| 0.9569444444444444 | 0 |
| 0.9576388888888889 | 0 |
| 0.9583333333333334 | 0 |
| 0.9590277777777777 | 0 |
| 0.9597222222222223 | 0 |
| 0.9604166666666667 | 0 |
| 0.9611111111111111 | 0 |
| 0.9618055555555555 | 0 |
| 0.9625 | 0 |
| 0.9631944444444445 | 0 |
| 0.9638888888888889 | 0 |
| 0.9645833333333332 | 0 |
| 0.9652777777777778 | 0 |
| 0.9659722222222222 | 0 |
| 0.9666666666666667 | 0 |
| 0.967361111111111 | 0 |
| 0.9680555555555556 | 0 |
| 0.96875 | 0 |
| 0.9694444444444444 | 0 |
| 0.970138888888889 | 0 |
| 0.9708333333333333 | 0 |
| 0.9715277777777778 | 0 |
| 0.9722222222222222 | 0 |
| 0.9729166666666668 | 0 |
| 0.9736111111111111 | 0 |
| 0.9743055555555555 | 0 |
| 0.975 | 0 |
| 0.9756944444444445 | 0 |
| 0.9763888888888889 | 0 |
| 0.9770833333333333 | 0 |
| 0.9777777777777777 | 0 |
| 0.9784722222222223 | 0 |
| 0.9791666666666666 | 0 |
| 0.9798611111111111 | 0 |
| 0.9805555555555556 | 0 |
| 0.9812500000000001 | 0 |
| 0.9819444444444444 | 0 |
| 0.9826388888888888 | 0 |
| 0.9833333333333334 | 0 |
| 0.9840277777777778 | 0 |
| 0.9847222222222222 | 0 |
| 0.9854166666666666 | 0 |
| 0.9861111111111112 | 0 |
| 0.9868055555555556 | 0 |
| 0.9874999999999999 | 0 |
| 0.9881944444444444 | 0 |
| 0.9888888888888889 | 0 |
| 0.9895833333333334 | 0 |
| 0.9902777777777777 | 0 |
| 0.9909722222222223 | 0 |
| 0.9916666666666667 | 0 |
| 0.9923611111111111 | 0 |
| 0.9930555555555555 | 0 |
| 0.99375 | 0 |
| 0.9944444444444445 | 0 |
| 0.9951388888888889 | 0 |
| 0.9958333333333332 | 0 |
| 0.9965277777777778 | 0 |
| 0.9972222222222222 | 0 |
| 0.9979166666666667 | 0 |
| 0.998611111111111 | 0 |
| 0.9993055555555556 | 0 |